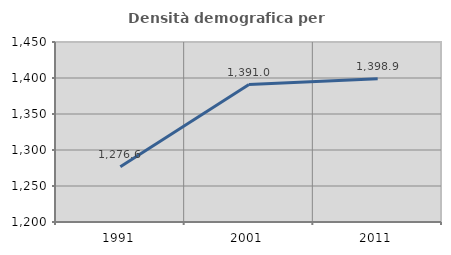
| Category | Densità demografica |
|---|---|
| 1991.0 | 1276.635 |
| 2001.0 | 1390.951 |
| 2011.0 | 1398.94 |